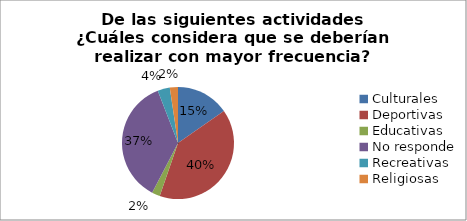
| Category | Series 0 |
|---|---|
| Culturales | 0.153 |
| Deportivas | 0.4 |
| Educativas | 0.024 |
| No responde | 0.365 |
| Recreativas | 0.035 |
| Religiosas | 0.024 |